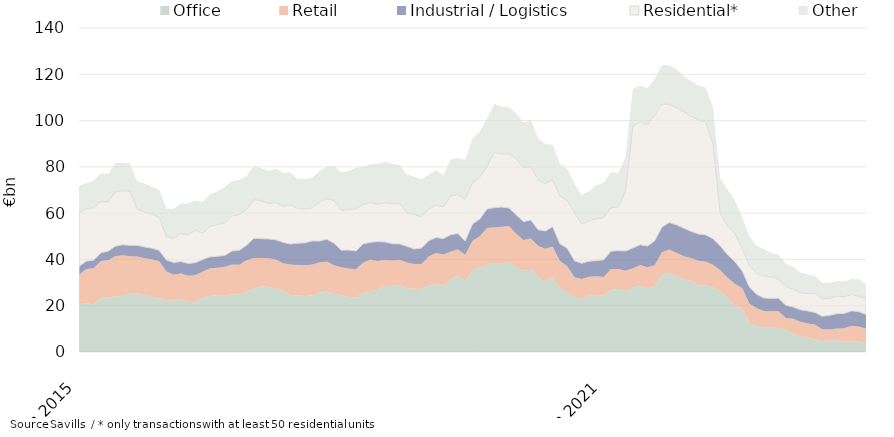
| Category | Office | Retail | Industrial / Logistics | Residential* | Other |
|---|---|---|---|---|---|
| 2015-06-01 | 20611425655.83 | 12812582743.14 | 3559231021.83 | 23077039312.51 | 11574720193.75 |
| 2015-07-01 | 21076839103.5 | 14823063179.21 | 3371725415.86 | 22644697118.35 | 11143910205.21 |
| 2015-08-01 | 20653227203.5 | 15571305695.21 | 3450767146.86 | 22691607883.35 | 11626767372.21 |
| 2015-09-01 | 23298875023.46 | 16009456775.73 | 3520511283.36 | 22121631489.35 | 12279196997.21 |
| 2015-10-01 | 23498374427.46 | 16189404746.36 | 3919085482.36 | 21349455176.35 | 11987539478.21 |
| 2015-11-01 | 23954025189.14 | 17369965927.5 | 4397719316.13 | 23451887702.29 | 12443601394.38 |
| 2015-12-01 | 24202213697.48 | 17618123151.04 | 4557113724.92 | 23375825542.77 | 11975940305.75 |
| 2016-01-01 | 25139700628.48 | 16272043440.89 | 4662502872.92 | 23334161447.77 | 12028959045.24 |
| 2016-02-01 | 25294714349.53 | 15953136713.43 | 4833139363.87 | 15563498654.77 | 12008953720.01 |
| 2016-03-01 | 24531552016.74 | 15986530585.16 | 4877967507.07 | 15108592339.77 | 12318880326.08 |
| 2016-04-01 | 23664635919.74 | 16375601042.51 | 4833846127.82 | 14760671477.37 | 11756957541.08 |
| 2016-05-01 | 23247789321.82 | 15930775136.51 | 4749671116.82 | 14232081715.37 | 11979556735.04 |
| 2016-06-01 | 22420837658.36 | 12351345639.5 | 4999570420.67 | 10189436595.87 | 12067576140.06 |
| 2016-07-01 | 22110698739.69 | 11244286742 | 5312245465.64 | 10404072475.53 | 12817090834.96 |
| 2016-08-01 | 23017210888.69 | 10865589625 | 5247332254.55 | 12050427222.53 | 12924367433.96 |
| 2016-09-01 | 21717860067.73 | 11265452481.91 | 5270185116.55 | 12498985369.53 | 13466325785.26 |
| 2016-10-01 | 21373387260.86 | 11859258925.28 | 5398267322.55 | 14009495152.42 | 12815064855.83 |
| 2016-11-01 | 23415620900.76 | 11358767497.14 | 5243284144.73 | 11319606979.49 | 13584628478.66 |
| 2016-12-01 | 24307948042.4 | 11930121185.43 | 4890351002.13 | 13270662270.49 | 13860642419.64 |
| 2017-01-01 | 24506316607.4 | 11942448226.96 | 4924744810.37 | 13669156871.49 | 14439441490.58 |
| 2017-02-01 | 24519637636.41 | 12367156977.09 | 4842785725 | 14202672047.49 | 15399823383.58 |
| 2017-03-01 | 24979801711.4 | 12788632177.37 | 5899654543.8 | 15102734386.79 | 14961863124.58 |
| 2017-04-01 | 24819990861.71 | 12853810575.9 | 6262060580.1 | 15423928697.19 | 15066124285.67 |
| 2017-05-01 | 26232596283.47 | 13433810629.15 | 6483702097.1 | 15457101085.2 | 14297593389.28 |
| 2017-06-01 | 27213166704.1 | 13392868477.5 | 8562546401.46 | 16743694810.79 | 14470141007.56 |
| 2017-07-01 | 28420051498.1 | 12241064346.93 | 8324132158.46 | 16422200120.79 | 13950696505.2 |
| 2017-08-01 | 28135534177.1 | 12347854135.93 | 8386695707.55 | 15384373722.79 | 13979801046.2 |
| 2017-09-01 | 27443892685.45 | 12555755916.94 | 8510058041.55 | 16031838529.78 | 14628427847.74 |
| 2017-10-01 | 26496035870.32 | 11848885272.94 | 9048046430.46 | 15582452666.87 | 14494347450.17 |
| 2017-11-01 | 24585217292.17 | 13253346842.83 | 8802947546.51 | 16950078576.87 | 13991797246.44 |
| 2017-12-01 | 24440717997.53 | 13103303236.48 | 9470343512.7 | 14943089012.87 | 12875205655.48 |
| 2018-01-01 | 24169632440.53 | 13302862745.1 | 9721702683.46 | 14639835220.86 | 12965625420.04 |
| 2018-02-01 | 24532655677.47 | 13264199130.65 | 10213193365.46 | 14254040308.86 | 12991286516.04 |
| 2018-03-01 | 25689146433.48 | 12942239136.64 | 9307934893.46 | 16861797743.49 | 13423676924.02 |
| 2018-04-01 | 26121570226.17 | 13001007210.76 | 9605919650.46 | 17541166648.49 | 13812859535.93 |
| 2018-05-01 | 25059149940.41 | 12453300846.51 | 9488564046.46 | 18391492426.48 | 14988664801.36 |
| 2018-06-01 | 24502115752.78 | 12171100363.34 | 7330050155.1 | 17325340647.56 | 16180804689.08 |
| 2018-07-01 | 23768042590.78 | 12321500226.32 | 7966869588.1 | 17451608751.56 | 16672007493.19 |
| 2018-08-01 | 23510045994.76 | 12246339005.19 | 7892000709.1 | 18149274126.41 | 17798374873.04 |
| 2018-09-01 | 25341157455.41 | 13289291079.55 | 8129841438.1 | 16963704659.42 | 16165594775.21 |
| 2018-10-01 | 26253931201.41 | 13715615099.55 | 7406435586.25 | 17175676866.32 | 16705006538.21 |
| 2018-11-01 | 26888009103.45 | 12462758251.61 | 8394898728.54 | 16109073420.32 | 17423267492.25 |
| 2018-12-01 | 28411133671.45 | 11468134571.41 | 7666795490.35 | 16990643494.32 | 17659710774.26 |
| 2019-01-01 | 28624375832.45 | 10940028832.41 | 7214323719.35 | 17176960675.2 | 17313329869.26 |
| 2019-02-01 | 28937833501.45 | 10947599659.13 | 6831262259.96 | 17531208622.2 | 16557159059.62 |
| 2019-03-01 | 27544432810.45 | 11126614873.99 | 6985219187.16 | 14491959503.27 | 16426926447.64 |
| 2019-04-01 | 27372510768.31 | 10677191485.85 | 6436402186.06 | 14907572108.14 | 16464762534.89 |
| 2019-05-01 | 27086717264.31 | 10962789793.85 | 6927571752.06 | 13595173453.14 | 15944373230.89 |
| 2019-06-01 | 28619667307.82 | 12636558136.82 | 6809920057.06 | 13635038337.47 | 14918522741.96 |
| 2019-07-01 | 29482520307.29 | 13283688977.99 | 6728675032.06 | 14018057902.47 | 15124173896.92 |
| 2019-08-01 | 28588686723.31 | 13536417530.12 | 6860393893.06 | 13753502392.62 | 13483032208.07 |
| 2019-09-01 | 31438753529.25 | 11989411711.7 | 7256389082.92 | 16861240835.62 | 15593147025.83 |
| 2019-10-01 | 33003593891.25 | 11314584887.7 | 6912990961.55 | 16703291438.74 | 15889588476.83 |
| 2019-11-01 | 30754652298.78 | 11289743755.75 | 5911146296.79 | 18052115733.74 | 16938721442.52 |
| 2019-12-01 | 35340825930.49 | 12730856743.58 | 7244059319.45 | 17720972058.74 | 19305491136.48 |
| 2020-01-01 | 36538141462.49 | 13437626311.58 | 7470737760.23 | 18158224812.87 | 19678967754.48 |
| 2020-02-01 | 38106058526.44 | 15501005020.07 | 8171253646.38 | 18363765931.37 | 20829016891.2 |
| 2020-03-01 | 38557852732.89 | 15349976510.85 | 8488042572.18 | 24050048197.37 | 20802972298.78 |
| 2020-04-01 | 38277850852.03 | 15864850742.87 | 8472070743.28 | 22908106646.5 | 20459637349.53 |
| 2020-05-01 | 38888659488.03 | 15505420856.87 | 7883168343.28 | 23336096487.5 | 20138175225.49 |
| 2020-06-01 | 36870967239.52 | 14251515683.91 | 8198149258.28 | 24099048462.5 | 19760686318.42 |
| 2020-07-01 | 35107846657.05 | 13290844419.76 | 7914460511.28 | 23512544941.5 | 19251006168.72 |
| 2020-08-01 | 35673705694.05 | 13411937855.76 | 7921045558.28 | 23019438157.5 | 20372181500.21 |
| 2020-09-01 | 32548010965.11 | 13310040555.38 | 7010552502.42 | 21488103702.49 | 18052298535.08 |
| 2020-10-01 | 30377863654.11 | 14234064134.38 | 7652755535.73 | 20471023725.49 | 17088470952.54 |
| 2020-11-01 | 32272707606.11 | 13313640008.38 | 8502380006.2 | 20188542385.49 | 15402605572.98 |
| 2020-12-01 | 27625165021.4 | 11666623548.74 | 7454893030.54 | 20611432435.49 | 13804487931.88 |
| 2021-01-01 | 25922292644.4 | 11088848627.74 | 7789843256.76 | 20716309315.49 | 13818236858.79 |
| 2021-02-01 | 23730070226.45 | 8619514795.53 | 7051796260 | 20712784697.99 | 12631393047.47 |
| 2021-03-01 | 22924554308 | 8568952326.89 | 6902626683.99 | 16854834848.99 | 12591192274.25 |
| 2021-04-01 | 24266534490 | 8199135375.01 | 6781950404.99 | 17402809013.99 | 12806454049.25 |
| 2021-05-01 | 24377578258 | 8326918360.01 | 6801070665.99 | 18167126016.99 | 14445583503.29 |
| 2021-06-01 | 24385512115 | 8003027807 | 7443919745.99 | 18226182212.99 | 14912428299.91 |
| 2021-07-01 | 26924708880 | 8972738056 | 7687165983.99 | 18785811487.74 | 15399479201.54 |
| 2021-08-01 | 27209285355 | 8614271981 | 7974574709.96 | 18901381563.74 | 14386449114.05 |
| 2021-09-01 | 26411633618 | 8699710631.91 | 8546995708.96 | 25629322018.75 | 14817521293.41 |
| 2021-10-01 | 27803946105.69 | 8411603241.91 | 8752082398.96 | 52501286139.75 | 16193947597.32 |
| 2021-11-01 | 28697609103.69 | 8929560417.91 | 8755552913.96 | 53116738980.75 | 15672351239.88 |
| 2021-12-01 | 27514290912.69 | 9152085737.86 | 9093524684.96 | 52306052488.25 | 15902058686.98 |
| 2022-01-01 | 28058935110.69 | 9374944364.07 | 10599440071.97 | 54152314759.25 | 15808671670.07 |
| 2022-02-01 | 33413067958.24 | 9651287708.13 | 10919760143.97 | 53241290616.79 | 16660777959.17 |
| 2022-03-01 | 34152785395.27 | 10180178921.43 | 11605373114.93 | 51107123050.79 | 16721923130.48 |
| 2022-04-01 | 32870499595.27 | 10059653956.43 | 12028654151.93 | 50503999418.79 | 16638583435.48 |
| 2022-05-01 | 31331193747.27 | 9993022535.43 | 12190846280.93 | 50270647458.79 | 15503593656.48 |
| 2022-06-01 | 30805994788.74 | 9769222856.42 | 11559057339.93 | 49707368541.79 | 15293074347.32 |
| 2022-07-01 | 28877258351.74 | 10509865163.8 | 11588976408.93 | 49231995043.04 | 14976215632.32 |
| 2022-08-01 | 28822980028.74 | 10300987397.8 | 11482422593.96 | 48711417034.02 | 15016259156.32 |
| 2022-09-01 | 27983288953.74 | 9741957492.89 | 11233616157.96 | 41148135072.17 | 15797891693.3 |
| 2022-10-01 | 26310579119.05 | 9011169668.89 | 10569008313.96 | 14127575596.17 | 14779961087.91 |
| 2022-11-01 | 23551831057.49 | 8552954212.89 | 9918439112.96 | 12393371042.17 | 15739891924.83 |
| 2022-12-01 | 20231163559.49 | 9220370648.94 | 9653844949.94 | 12245486492.67 | 14250701648.87 |
| 2023-01-01 | 18800895172.49 | 8804022046.73 | 7498342059.93 | 9794524565.65 | 13506223780.87 |
| 2023-02-01 | 12507936896.94 | 8493711595.67 | 7080810858.93 | 9430428360.11 | 12483668427.01 |
| 2023-03-01 | 11277202460.91 | 7614753403.37 | 6012796784.98 | 9149700734.11 | 11840579592.34 |
| 2023-04-01 | 10704483085.91 | 6968177239.37 | 5667231787.98 | 9625573016.53 | 11408854941.34 |
| 2023-05-01 | 10662217484.91 | 6917992803.37 | 5605162727.98 | 9203354222.53 | 10339897950.34 |
| 2023-06-01 | 10332027987.44 | 7302312621.37 | 5581733960.95 | 8340282543.53 | 10551986664.88 |
| 2023-07-01 | 9301131588.44 | 5438726603.99 | 5472679568.92 | 8053498413.29 | 9836570964.88 |
| 2023-08-01 | 8157547411.44 | 6203529957.29 | 5117810292.92 | 7735919836.31 | 9589231933.88 |
| 2023-09-01 | 6728450956.44 | 6313806135.29 | 5231318723.92 | 7354511172.16 | 8683241369.9 |
| 2023-10-01 | 6081386773.44 | 6264796771.29 | 5411649029.9 | 7497072986.16 | 8259637602.92 |
| 2023-11-01 | 5538120337 | 6311967179.29 | 5234388564.9 | 8430875484.01 | 7249774993 |
| 2023-12-01 | 4793393456 | 5016371925.29 | 5638783565.87 | 7663175882.01 | 6774136199 |
| 2024-01-01 | 4970977845 | 4787441645.29 | 6109375304.87 | 7327336254.03 | 6726730792 |
| 2024-02-01 | 5179162773 | 4960669781.29 | 6433838924.84 | 7598158912.03 | 6456251492 |
| 2024-03-01 | 4675106293 | 5563908045.29 | 6440176524.84 | 7203825918.03 | 6528102127 |
| 2024-04-01 | 4691427868 | 6605780221.29 | 6505272954.84 | 7016072122.61 | 6685122205 |
| 2024-05-01 | 4480114069 | 6535273548.29 | 6434309895.84 | 6655796993.61 | 7379177890 |
| 2024-06-01 | 3941040771 | 6067766454.3 | 6208709668.87 | 6740390133.61 | 6317268523 |